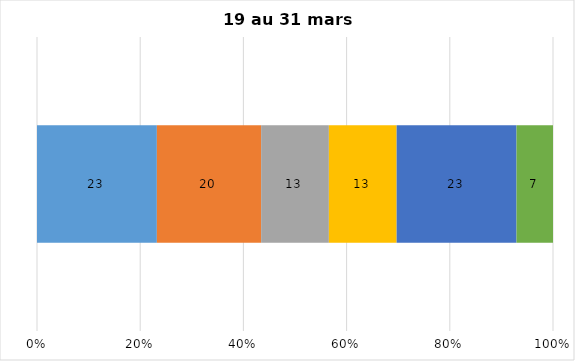
| Category | Plusieurs fois par jour | Une fois par jour | Quelques fois par semaine   | Une fois par semaine ou moins   |  Jamais   |  Je n’utilise pas les médias sociaux |
|---|---|---|---|---|---|---|
| 0 | 23 | 20 | 13 | 13 | 23 | 7 |